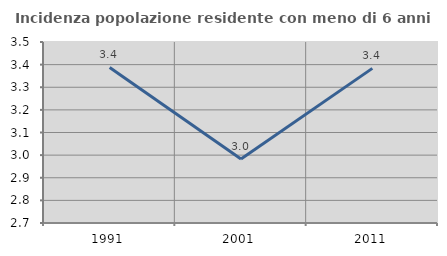
| Category | Incidenza popolazione residente con meno di 6 anni |
|---|---|
| 1991.0 | 3.388 |
| 2001.0 | 2.983 |
| 2011.0 | 3.383 |